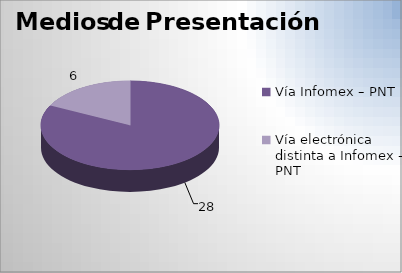
| Category | Series 0 |
|---|---|
| Vía Infomex – PNT | 28 |
| Vía electrónica distinta a Infomex - PNT | 6 |